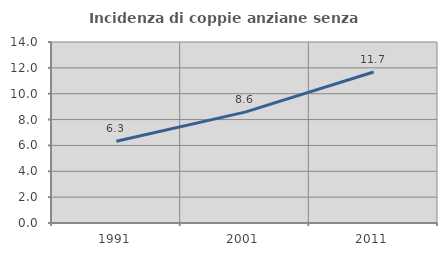
| Category | Incidenza di coppie anziane senza figli  |
|---|---|
| 1991.0 | 6.33 |
| 2001.0 | 8.577 |
| 2011.0 | 11.681 |